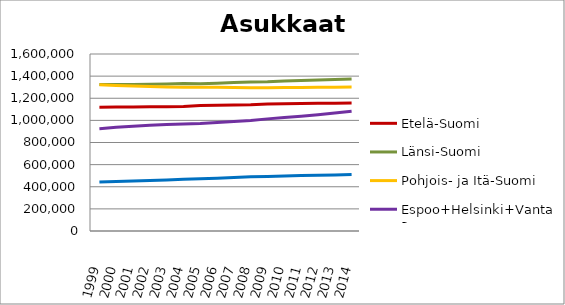
| Category | Etelä-Suomi | Länsi-Suomi | Pohjois- ja Itä-Suomi | Espoo+Helsinki+Vantaa | Muu Uusimaa |
|---|---|---|---|---|---|
| 1999.0 | 1119141 | 1324963 | 1321944 | 925139 | 442834 |
| 2000.0 | 1120065 | 1324857 | 1315685 | 937176 | 447813 |
| 2001.0 | 1120521 | 1324984 | 1310382 | 947216 | 452236 |
| 2002.0 | 1122378 | 1326963 | 1305818 | 956410 | 457324 |
| 2003.0 | 1124008 | 1329061 | 1301809 | 963203 | 461957 |
| 2004.0 | 1125872 | 1332612 | 1299823 | 967600 | 467478 |
| 2005.0 | 1133731 | 1331825 | 1299958 | 971947 | 472620 |
| 2006.0 | 1136150 | 1335702 | 1299741 | 979890 | 477331 |
| 2007.0 | 1138352 | 1341952 | 1297134 | 989251 | 483343 |
| 2008.0 | 1140953 | 1347497 | 1296022 | 999100 | 489759 |
| 2009.0 | 1147144 | 1349600 | 1295480 | 1013594 | 493040 |
| 2010.0 | 1149332 | 1355168 | 1296335 | 1025316 | 497542 |
| 2011.0 | 1152240 | 1360041 | 1297324 | 1036574 | 501090 |
| 2012.0 | 1154451 | 1365259 | 1298773 | 1050824 | 503606 |
| 2013.0 | 1155355 | 1370384 | 1300222 | 1066104 | 506108 |
| 2014.0 | 1156498 | 1374403 | 1300846 | 1081515 | 509612 |